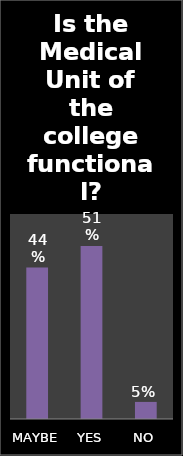
| Category | Series 0 |
|---|---|
| MAYBE | 0.443 |
| YES | 0.507 |
| NO | 0.05 |